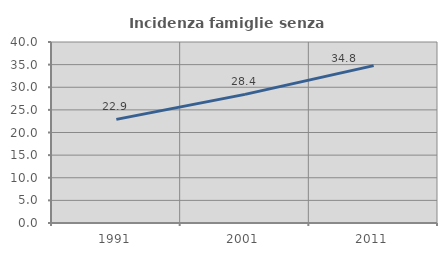
| Category | Incidenza famiglie senza nuclei |
|---|---|
| 1991.0 | 22.904 |
| 2001.0 | 28.429 |
| 2011.0 | 34.773 |